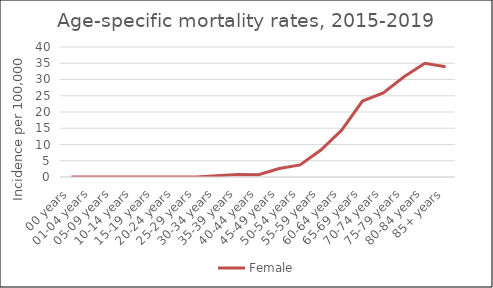
| Category | Female |
|---|---|
| 00 years | 0 |
| 01-04 years | 0 |
| 05-09 years | 0 |
| 10-14 years | 0 |
| 15-19 years | 0 |
| 20-24 years | 0 |
| 25-29 years | 0 |
| 30-34 years | 0.42 |
| 35-39 years | 0.74 |
| 40-44 years | 0.72 |
| 45-49 years | 2.6 |
| 50-54 years | 3.73 |
| 55-59 years | 8.3 |
| 60-64 years | 14.4 |
| 65-69 years | 23.37 |
| 70-74 years | 25.9 |
| 75-79 years | 30.86 |
| 80-84 years | 34.99 |
| 85+ years | 33.95 |